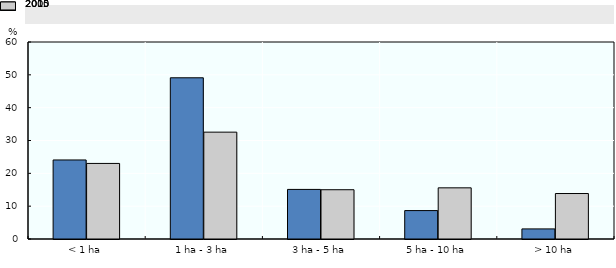
| Category | 2000 | 2015 |
|---|---|---|
| < 1 ha | 24.072 | 23.017 |
| 1 ha - 3 ha | 49.098 | 32.543 |
| 3 ha - 5 ha | 15.101 | 15.007 |
| 5 ha - 10 ha | 8.653 | 15.583 |
| > 10 ha | 3.076 | 13.849 |